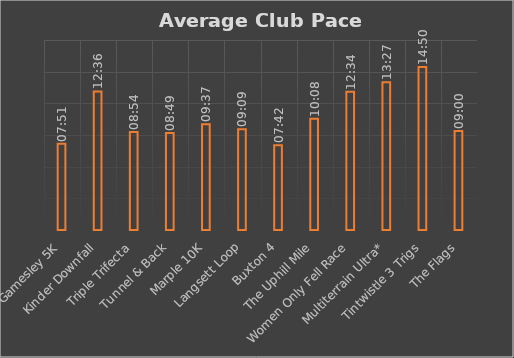
| Category | The Flags |
|---|---|
| Gamesley 5K | 0.005 |
| Kinder Downfall | 0.009 |
| Triple Trifecta | 0.006 |
| Tunnel & Back | 0.006 |
| Marple 10K | 0.007 |
| Langsett Loop | 0.006 |
| Buxton 4 | 0.005 |
| The Uphill Mile | 0.007 |
| Women Only Fell Race | 0.009 |
| Multiterrain Ultra* | 0.009 |
| Tintwistle 3 Trigs | 0.01 |
| The Flags | 0.006 |